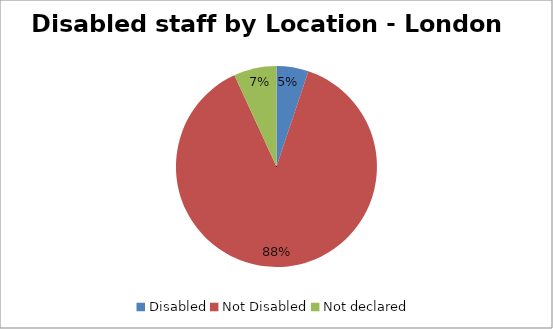
| Category | London |
|---|---|
| Disabled | 0.051 |
| Not Disabled | 0.88 |
| Not declared | 0.069 |